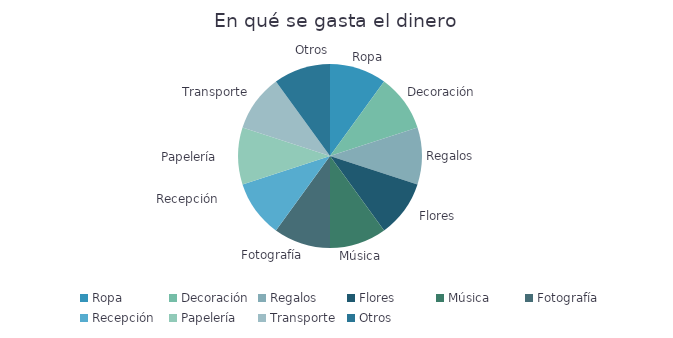
| Category | Importe |
|---|---|
| Ropa | 1 |
| Decoración | 1 |
| Regalos | 1 |
| Flores | 1 |
| Música | 1 |
| Fotografía | 1 |
| Recepción | 1 |
| Papelería | 1 |
| Transporte | 1 |
| Otros | 1 |